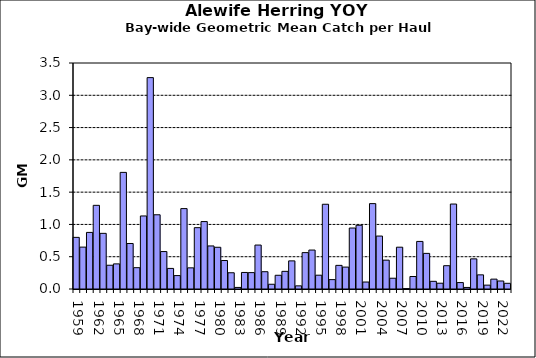
| Category | Series 0 |
|---|---|
| 1959.0 | 0.8 |
| 1960.0 | 0.649 |
| 1961.0 | 0.876 |
| 1962.0 | 1.296 |
| 1963.0 | 0.862 |
| 1964.0 | 0.368 |
| 1965.0 | 0.389 |
| 1966.0 | 1.806 |
| 1967.0 | 0.705 |
| 1968.0 | 0.33 |
| 1969.0 | 1.131 |
| 1970.0 | 3.274 |
| 1971.0 | 1.149 |
| 1972.0 | 0.58 |
| 1973.0 | 0.319 |
| 1974.0 | 0.208 |
| 1975.0 | 1.245 |
| 1976.0 | 0.328 |
| 1977.0 | 0.95 |
| 1978.0 | 1.044 |
| 1979.0 | 0.667 |
| 1980.0 | 0.646 |
| 1981.0 | 0.441 |
| 1982.0 | 0.252 |
| 1983.0 | 0.024 |
| 1984.0 | 0.256 |
| 1985.0 | 0.254 |
| 1986.0 | 0.681 |
| 1987.0 | 0.268 |
| 1988.0 | 0.073 |
| 1989.0 | 0.213 |
| 1990.0 | 0.273 |
| 1991.0 | 0.436 |
| 1992.0 | 0.049 |
| 1993.0 | 0.563 |
| 1994.0 | 0.603 |
| 1995.0 | 0.214 |
| 1996.0 | 1.312 |
| 1997.0 | 0.145 |
| 1998.0 | 0.366 |
| 1999.0 | 0.339 |
| 2000.0 | 0.944 |
| 2001.0 | 0.987 |
| 2002.0 | 0.108 |
| 2003.0 | 1.322 |
| 2004.0 | 0.82 |
| 2005.0 | 0.447 |
| 2006.0 | 0.167 |
| 2007.0 | 0.647 |
| 2008.0 | 0.005 |
| 2009.0 | 0.193 |
| 2010.0 | 0.737 |
| 2011.0 | 0.552 |
| 2012.0 | 0.119 |
| 2013.0 | 0.09 |
| 2014.0 | 0.361 |
| 2015.0 | 1.316 |
| 2016.0 | 0.1 |
| 2017.0 | 0.024 |
| 2018.0 | 0.467 |
| 2019.0 | 0.219 |
| 2020.0 | 0.06 |
| 2021.0 | 0.153 |
| 2022.0 | 0.124 |
| 2023.0 | 0.088 |